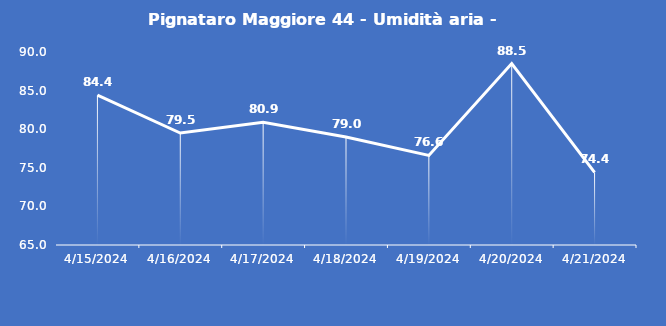
| Category | Pignataro Maggiore 44 - Umidità aria - Grezzo (%) |
|---|---|
| 4/15/24 | 84.4 |
| 4/16/24 | 79.5 |
| 4/17/24 | 80.9 |
| 4/18/24 | 79 |
| 4/19/24 | 76.6 |
| 4/20/24 | 88.5 |
| 4/21/24 | 74.4 |